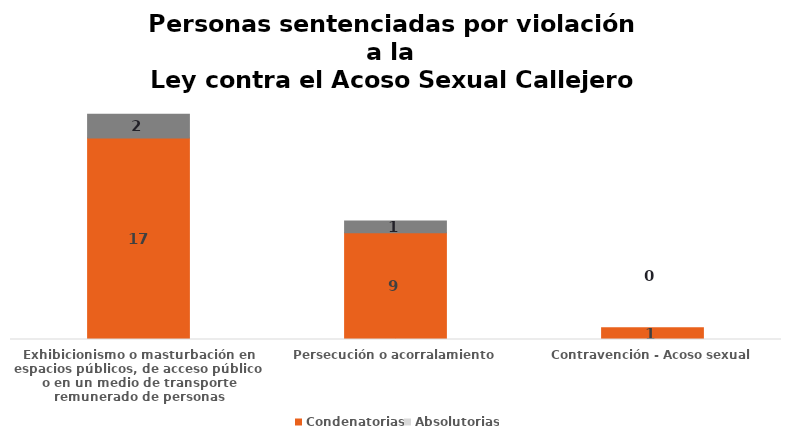
| Category | Condenatorias | Absolutorias |
|---|---|---|
| Exhibicionismo o masturbación en espacios públicos, de acceso público o en un medio de transporte remunerado de personas | 17 | 2 |
| Persecución o acorralamiento | 9 | 1 |
| Contravención - Acoso sexual | 1 | 0 |